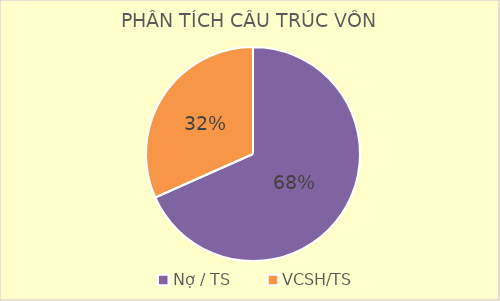
| Category | Series 0 |
|---|---|
| Nợ / TS | 0.683 |
| VCSH/TS | 0.317 |